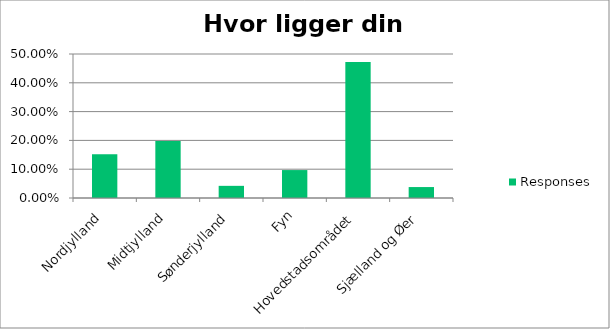
| Category | Responses |
|---|---|
| Nordjylland | 0.152 |
| Midtjylland | 0.198 |
| Sønderjylland | 0.042 |
| Fyn | 0.097 |
| Hovedstadsområdet | 0.473 |
| Sjælland og Øer | 0.038 |